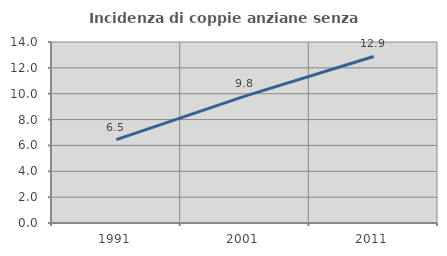
| Category | Incidenza di coppie anziane senza figli  |
|---|---|
| 1991.0 | 6.454 |
| 2001.0 | 9.815 |
| 2011.0 | 12.879 |